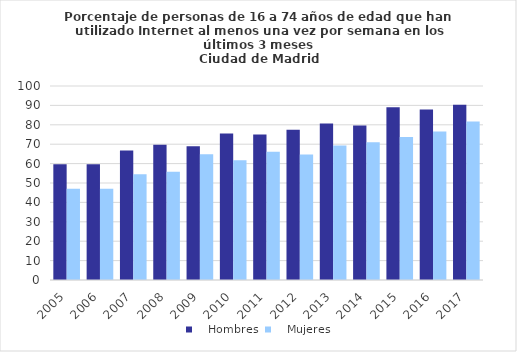
| Category |    Hombres |    Mujeres |
|---|---|---|
| 2005.0 | 59.632 | 47.023 |
| 2006.0 | 59.632 | 47.023 |
| 2007.0 | 66.783 | 54.446 |
| 2008.0 | 69.759 | 55.735 |
| 2009.0 | 68.931 | 64.878 |
| 2010.0 | 75.454 | 61.76 |
| 2011.0 | 74.938 | 66.128 |
| 2012.0 | 77.434 | 64.635 |
| 2013.0 | 80.669 | 69.336 |
| 2014.0 | 79.693 | 70.972 |
| 2015.0 | 89.014 | 73.772 |
| 2016.0 | 87.85 | 76.513 |
| 2017.0 | 90.37 | 81.758 |